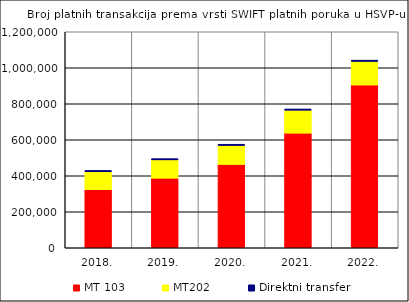
| Category | MT 103 | MT202 | Direktni transfer |
|---|---|---|---|
| 2018. | 322916 | 99163 | 7768 |
| 2019. | 386560 | 101849 | 6829 |
| 2020. | 463022 | 105582 | 6676 |
| 2021. | 636960 | 127507 | 6709 |
| 2022. | 904261 | 131275 | 6833 |